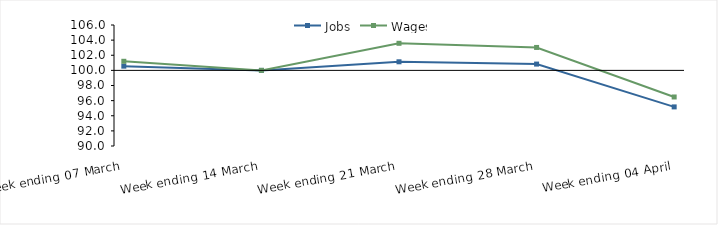
| Category | Jobs | Wages |
|---|---|---|
| 0 | 100.561 | 101.202 |
| 1900-01-01 | 100 | 100 |
| 1900-01-02 | 101.134 | 103.58 |
| 1900-01-03 | 100.832 | 103.032 |
| 1900-01-04 | 95.17 | 96.482 |